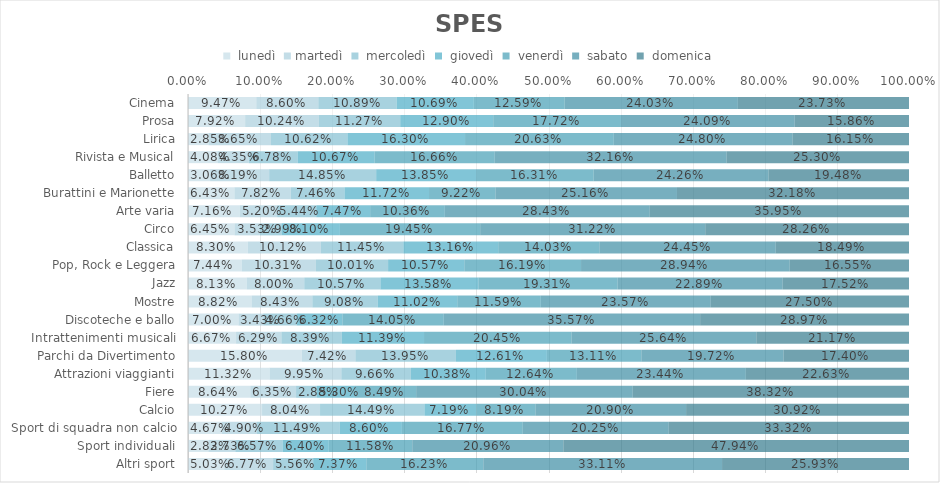
| Category |  lunedì | martedì |  mercoledì |  giovedì |  venerdì |  sabato |  domenica |
|---|---|---|---|---|---|---|---|
| Cinema | 0.095 | 0.086 | 0.109 | 0.107 | 0.126 | 0.24 | 0.237 |
| Prosa | 0.079 | 0.102 | 0.113 | 0.129 | 0.177 | 0.241 | 0.159 |
| Lirica | 0.028 | 0.087 | 0.106 | 0.163 | 0.206 | 0.248 | 0.161 |
| Rivista e Musical | 0.041 | 0.043 | 0.068 | 0.107 | 0.167 | 0.322 | 0.253 |
| Balletto | 0.031 | 0.082 | 0.148 | 0.139 | 0.163 | 0.243 | 0.195 |
| Burattini e Marionette | 0.064 | 0.078 | 0.075 | 0.117 | 0.092 | 0.252 | 0.322 |
| Arte varia | 0.072 | 0.052 | 0.054 | 0.075 | 0.104 | 0.284 | 0.36 |
| Circo | 0.065 | 0.035 | 0.03 | 0.081 | 0.195 | 0.312 | 0.283 |
| Classica | 0.083 | 0.101 | 0.114 | 0.132 | 0.14 | 0.245 | 0.185 |
| Pop, Rock e Leggera | 0.074 | 0.103 | 0.1 | 0.106 | 0.162 | 0.289 | 0.165 |
| Jazz | 0.081 | 0.08 | 0.106 | 0.136 | 0.193 | 0.229 | 0.175 |
| Mostre | 0.088 | 0.084 | 0.091 | 0.11 | 0.116 | 0.236 | 0.275 |
| Discoteche e ballo | 0.07 | 0.034 | 0.047 | 0.063 | 0.141 | 0.356 | 0.29 |
| Intrattenimenti musicali | 0.067 | 0.063 | 0.084 | 0.114 | 0.205 | 0.256 | 0.212 |
| Parchi da Divertimento | 0.158 | 0.074 | 0.139 | 0.126 | 0.131 | 0.197 | 0.174 |
| Attrazioni viaggianti | 0.113 | 0.099 | 0.097 | 0.104 | 0.126 | 0.234 | 0.226 |
| Fiere | 0.086 | 0.063 | 0.029 | 0.053 | 0.085 | 0.3 | 0.383 |
| Calcio | 0.103 | 0.08 | 0.145 | 0.072 | 0.082 | 0.209 | 0.309 |
| Sport di squadra non calcio | 0.047 | 0.049 | 0.115 | 0.086 | 0.168 | 0.202 | 0.333 |
| Sport individuali | 0.028 | 0.037 | 0.066 | 0.064 | 0.116 | 0.21 | 0.479 |
| Altri sport | 0.05 | 0.068 | 0.056 | 0.074 | 0.162 | 0.331 | 0.259 |